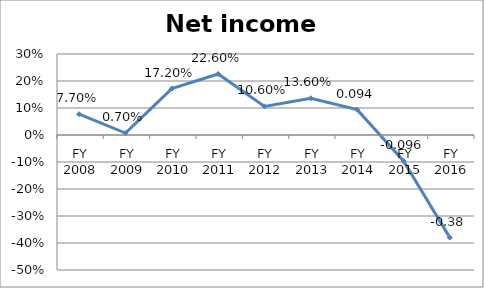
| Category | Net income ratio |
|---|---|
| FY 2016 | -0.38 |
| FY 2015 | -0.096 |
| FY 2014 | 0.094 |
| FY 2013 | 0.136 |
| FY 2012 | 0.106 |
| FY 2011 | 0.226 |
| FY 2010 | 0.172 |
| FY 2009 | 0.007 |
| FY 2008 | 0.077 |